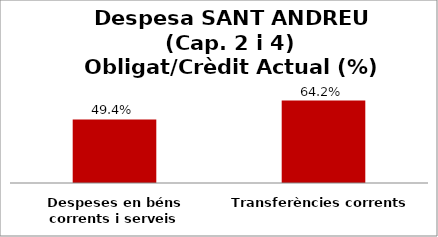
| Category | Series 0 |
|---|---|
| Despeses en béns corrents i serveis | 0.494 |
| Transferències corrents | 0.642 |